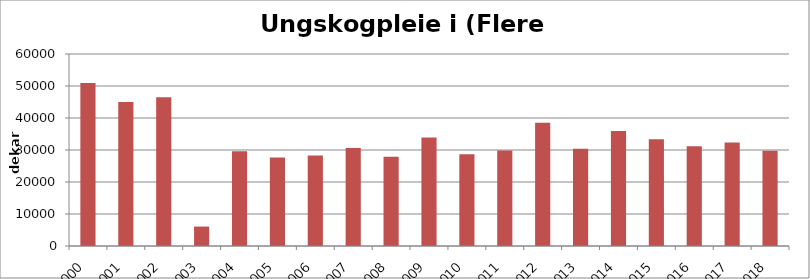
| Category | Totalt |
|---|---|
| 2000 | 50942 |
| 2001 | 44997 |
| 2002 | 46498 |
| 2003 | 6074 |
| 2004 | 29579 |
| 2005 | 27650 |
| 2006 | 28302 |
| 2007 | 30604 |
| 2008 | 27921 |
| 2009 | 33890 |
| 2010 | 28659 |
| 2011 | 29819 |
| 2012 | 38496 |
| 2013 | 30352 |
| 2014 | 35937 |
| 2015 | 33351 |
| 2016 | 31182 |
| 2017 | 32371 |
| 2018 | 29782 |